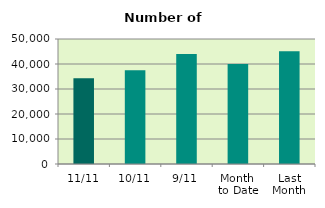
| Category | Series 0 |
|---|---|
| 11/11 | 34342 |
| 10/11 | 37544 |
| 9/11 | 44012 |
| Month 
to Date | 40030.889 |
| Last
Month | 45060.857 |